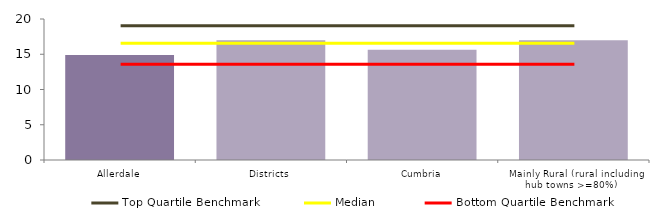
| Category | Block Data |
|---|---|
| Allerdale | 14.884 |
| Districts | 16.973 |
| Cumbria | 15.639 |
|  Mainly Rural (rural including hub towns >=80%)   | 16.981 |